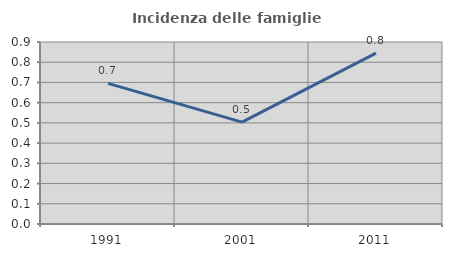
| Category | Incidenza delle famiglie numerose |
|---|---|
| 1991.0 | 0.696 |
| 2001.0 | 0.504 |
| 2011.0 | 0.845 |